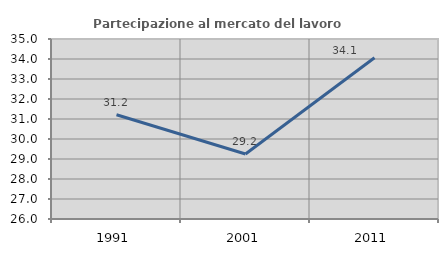
| Category | Partecipazione al mercato del lavoro  femminile |
|---|---|
| 1991.0 | 31.213 |
| 2001.0 | 29.247 |
| 2011.0 | 34.063 |